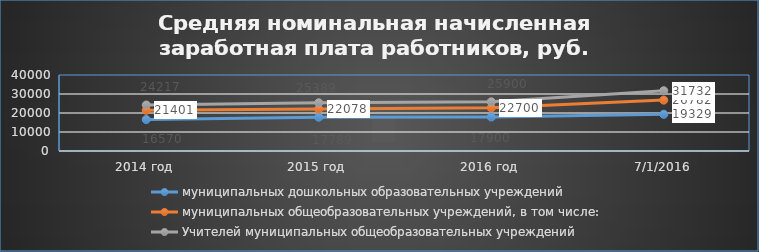
| Category | муниципальных дошкольных образовательных учреждений | муниципальных общеобразовательных учреждений, в том числе: | Учителей муниципальных общеобразовательных учреждений |
|---|---|---|---|
| 2014 год | 16570 | 21401 | 24217 |
| 2015 год | 17789 | 22078 | 25389 |
| 2016 год | 17900 | 22700 | 25900 |
| 01.07.2016 | 19329 | 26782 | 31732 |